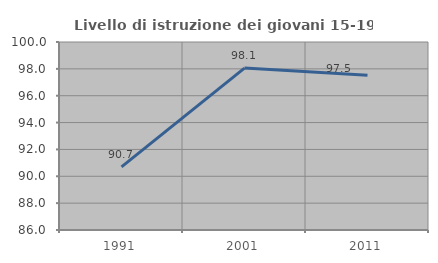
| Category | Livello di istruzione dei giovani 15-19 anni |
|---|---|
| 1991.0 | 90.698 |
| 2001.0 | 98.058 |
| 2011.0 | 97.531 |